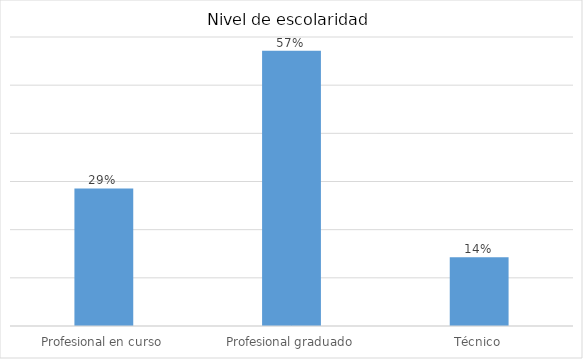
| Category | Series 0 |
|---|---|
| Profesional en curso | 0.286 |
| Profesional graduado | 0.571 |
| Técnico | 0.143 |